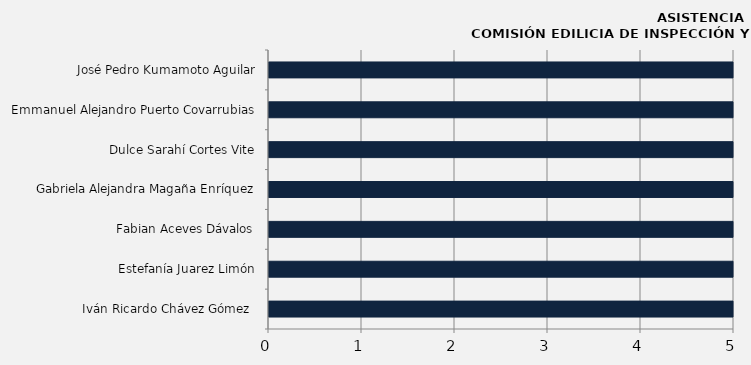
| Category | Iván Ricardo Chávez Gómez  |
|---|---|
| Iván Ricardo Chávez Gómez  | 12 |
| Estefanía Juarez Limón | 12 |
| Fabian Aceves Dávalos | 11 |
| Gabriela Alejandra Magaña Enríquez | 11 |
| Dulce Sarahí Cortes Vite | 10 |
| Emmanuel Alejandro Puerto Covarrubias | 7 |
| José Pedro Kumamoto Aguilar | 8 |